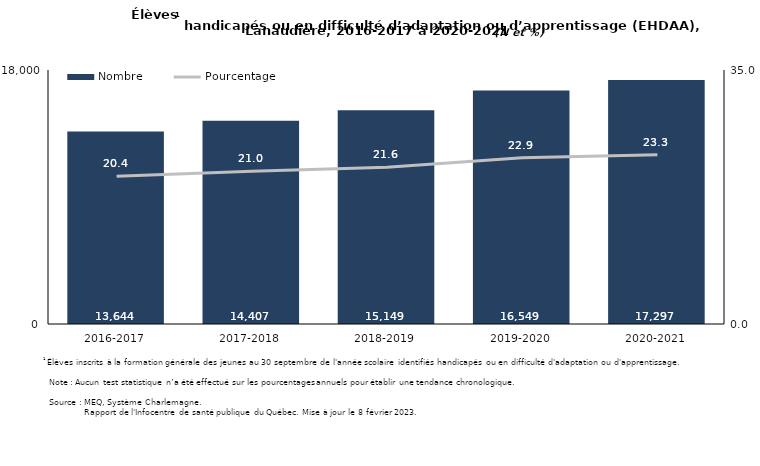
| Category | Nombre |
|---|---|
| 2016-2017 | 13644 |
| 2017-2018 | 14407 |
| 2018-2019 | 15149 |
| 2019-2020 | 16549 |
| 2020-2021 | 17297 |